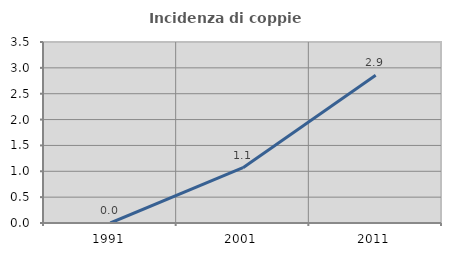
| Category | Incidenza di coppie miste |
|---|---|
| 1991.0 | 0 |
| 2001.0 | 1.07 |
| 2011.0 | 2.857 |